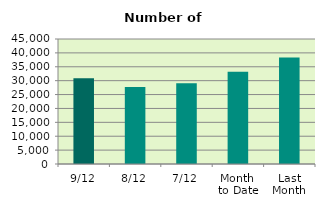
| Category | Series 0 |
|---|---|
| 9/12 | 30860 |
| 8/12 | 27708 |
| 7/12 | 29080 |
| Month 
to Date | 33239.143 |
| Last
Month | 38326.182 |